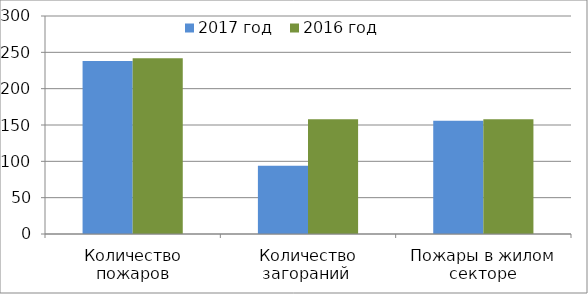
| Category | 2017 год | 2016 год |
|---|---|---|
| Количество пожаров | 238 | 242 |
| Количество загораний  | 94 | 158 |
| Пожары в жилом секторе | 156 | 158 |